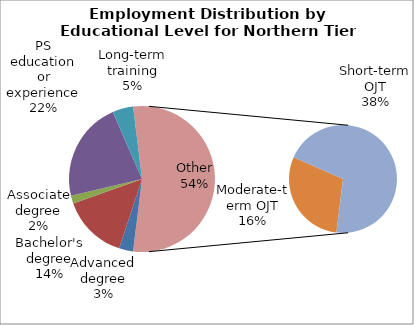
| Category | Series 0 |
|---|---|
| Advanced degree | 2000 |
| Bachelor's degree | 9320 |
| Associate degree | 1130 |
| PS education or experience | 14260 |
| Long-term training | 2940 |
| Moderate-term OJT | 10290 |
| Short-term OJT | 24390 |